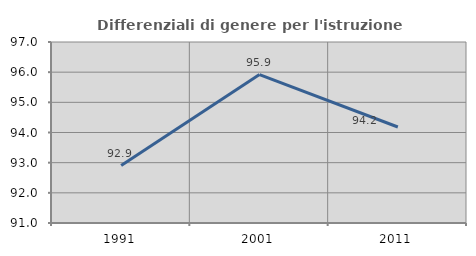
| Category | Differenziali di genere per l'istruzione superiore |
|---|---|
| 1991.0 | 92.902 |
| 2001.0 | 95.922 |
| 2011.0 | 94.181 |